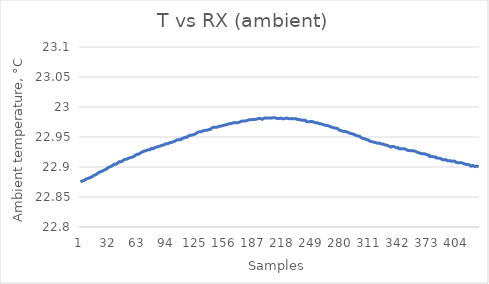
| Category | TRX |
|---|---|
| 0 | 22.875 |
| 1 | 22.876 |
| 2 | 22.877 |
| 3 | 22.877 |
| 4 | 22.878 |
| 5 | 22.878 |
| 6 | 22.88 |
| 7 | 22.88 |
| 8 | 22.881 |
| 9 | 22.881 |
| 10 | 22.882 |
| 11 | 22.882 |
| 12 | 22.883 |
| 13 | 22.885 |
| 14 | 22.886 |
| 15 | 22.887 |
| 16 | 22.887 |
| 17 | 22.887 |
| 18 | 22.889 |
| 19 | 22.89 |
| 20 | 22.891 |
| 21 | 22.892 |
| 22 | 22.892 |
| 23 | 22.892 |
| 24 | 22.894 |
| 25 | 22.894 |
| 26 | 22.895 |
| 27 | 22.897 |
| 28 | 22.897 |
| 29 | 22.899 |
| 30 | 22.899 |
| 31 | 22.9 |
| 32 | 22.901 |
| 33 | 22.901 |
| 34 | 22.902 |
| 35 | 22.903 |
| 36 | 22.905 |
| 37 | 22.905 |
| 38 | 22.905 |
| 39 | 22.906 |
| 40 | 22.907 |
| 41 | 22.909 |
| 42 | 22.909 |
| 43 | 22.909 |
| 44 | 22.91 |
| 45 | 22.91 |
| 46 | 22.912 |
| 47 | 22.911 |
| 48 | 22.913 |
| 49 | 22.913 |
| 50 | 22.913 |
| 51 | 22.915 |
| 52 | 22.915 |
| 53 | 22.914 |
| 54 | 22.916 |
| 55 | 22.918 |
| 56 | 22.917 |
| 57 | 22.918 |
| 58 | 22.919 |
| 59 | 22.92 |
| 60 | 22.921 |
| 61 | 22.921 |
| 62 | 22.921 |
| 63 | 22.923 |
| 64 | 22.923 |
| 65 | 22.924 |
| 66 | 22.925 |
| 67 | 22.924 |
| 68 | 22.926 |
| 69 | 22.927 |
| 70 | 22.927 |
| 71 | 22.929 |
| 72 | 22.929 |
| 73 | 22.928 |
| 74 | 22.929 |
| 75 | 22.93 |
| 76 | 22.931 |
| 77 | 22.931 |
| 78 | 22.93 |
| 79 | 22.932 |
| 80 | 22.932 |
| 81 | 22.933 |
| 82 | 22.933 |
| 83 | 22.934 |
| 84 | 22.934 |
| 85 | 22.935 |
| 86 | 22.936 |
| 87 | 22.936 |
| 88 | 22.937 |
| 89 | 22.937 |
| 90 | 22.937 |
| 91 | 22.939 |
| 92 | 22.939 |
| 93 | 22.939 |
| 94 | 22.939 |
| 95 | 22.94 |
| 96 | 22.94 |
| 97 | 22.941 |
| 98 | 22.941 |
| 99 | 22.942 |
| 100 | 22.943 |
| 101 | 22.943 |
| 102 | 22.943 |
| 103 | 22.945 |
| 104 | 22.944 |
| 105 | 22.945 |
| 106 | 22.946 |
| 107 | 22.945 |
| 108 | 22.947 |
| 109 | 22.947 |
| 110 | 22.948 |
| 111 | 22.948 |
| 112 | 22.95 |
| 113 | 22.95 |
| 114 | 22.95 |
| 115 | 22.952 |
| 116 | 22.953 |
| 117 | 22.953 |
| 118 | 22.952 |
| 119 | 22.953 |
| 120 | 22.953 |
| 121 | 22.954 |
| 122 | 22.956 |
| 123 | 22.955 |
| 124 | 22.956 |
| 125 | 22.958 |
| 126 | 22.958 |
| 127 | 22.959 |
| 128 | 22.958 |
| 129 | 22.959 |
| 130 | 22.961 |
| 131 | 22.96 |
| 132 | 22.962 |
| 133 | 22.961 |
| 134 | 22.962 |
| 135 | 22.961 |
| 136 | 22.961 |
| 137 | 22.962 |
| 138 | 22.964 |
| 139 | 22.963 |
| 140 | 22.965 |
| 141 | 22.964 |
| 142 | 22.966 |
| 143 | 22.966 |
| 144 | 22.966 |
| 145 | 22.966 |
| 146 | 22.966 |
| 147 | 22.967 |
| 148 | 22.968 |
| 149 | 22.968 |
| 150 | 22.968 |
| 151 | 22.968 |
| 152 | 22.969 |
| 153 | 22.97 |
| 154 | 22.97 |
| 155 | 22.971 |
| 156 | 22.97 |
| 157 | 22.971 |
| 158 | 22.972 |
| 159 | 22.972 |
| 160 | 22.972 |
| 161 | 22.972 |
| 162 | 22.973 |
| 163 | 22.974 |
| 164 | 22.974 |
| 165 | 22.975 |
| 166 | 22.974 |
| 167 | 22.975 |
| 168 | 22.974 |
| 169 | 22.975 |
| 170 | 22.975 |
| 171 | 22.976 |
| 172 | 22.976 |
| 173 | 22.976 |
| 174 | 22.977 |
| 175 | 22.977 |
| 176 | 22.977 |
| 177 | 22.976 |
| 178 | 22.978 |
| 179 | 22.977 |
| 180 | 22.979 |
| 181 | 22.978 |
| 182 | 22.979 |
| 183 | 22.979 |
| 184 | 22.979 |
| 185 | 22.98 |
| 186 | 22.979 |
| 187 | 22.98 |
| 188 | 22.98 |
| 189 | 22.979 |
| 190 | 22.981 |
| 191 | 22.981 |
| 192 | 22.981 |
| 193 | 22.98 |
| 194 | 22.979 |
| 195 | 22.98 |
| 196 | 22.981 |
| 197 | 22.981 |
| 198 | 22.982 |
| 199 | 22.981 |
| 200 | 22.981 |
| 201 | 22.982 |
| 202 | 22.982 |
| 203 | 22.981 |
| 204 | 22.982 |
| 205 | 22.981 |
| 206 | 22.982 |
| 207 | 22.981 |
| 208 | 22.982 |
| 209 | 22.982 |
| 210 | 22.981 |
| 211 | 22.982 |
| 212 | 22.981 |
| 213 | 22.981 |
| 214 | 22.982 |
| 215 | 22.982 |
| 216 | 22.98 |
| 217 | 22.98 |
| 218 | 22.981 |
| 219 | 22.981 |
| 220 | 22.982 |
| 221 | 22.98 |
| 222 | 22.981 |
| 223 | 22.979 |
| 224 | 22.98 |
| 225 | 22.981 |
| 226 | 22.981 |
| 227 | 22.98 |
| 228 | 22.981 |
| 229 | 22.98 |
| 230 | 22.981 |
| 231 | 22.98 |
| 232 | 22.979 |
| 233 | 22.979 |
| 234 | 22.979 |
| 235 | 22.979 |
| 236 | 22.978 |
| 237 | 22.978 |
| 238 | 22.978 |
| 239 | 22.977 |
| 240 | 22.978 |
| 241 | 22.976 |
| 242 | 22.976 |
| 243 | 22.975 |
| 244 | 22.976 |
| 245 | 22.976 |
| 246 | 22.976 |
| 247 | 22.976 |
| 248 | 22.975 |
| 249 | 22.975 |
| 250 | 22.975 |
| 251 | 22.974 |
| 252 | 22.974 |
| 253 | 22.974 |
| 254 | 22.973 |
| 255 | 22.972 |
| 256 | 22.972 |
| 257 | 22.972 |
| 258 | 22.972 |
| 259 | 22.971 |
| 260 | 22.971 |
| 261 | 22.97 |
| 262 | 22.97 |
| 263 | 22.969 |
| 264 | 22.969 |
| 265 | 22.969 |
| 266 | 22.968 |
| 267 | 22.967 |
| 268 | 22.967 |
| 269 | 22.966 |
| 270 | 22.966 |
| 271 | 22.965 |
| 272 | 22.964 |
| 273 | 22.965 |
| 274 | 22.964 |
| 275 | 22.964 |
| 276 | 22.962 |
| 277 | 22.962 |
| 278 | 22.961 |
| 279 | 22.961 |
| 280 | 22.96 |
| 281 | 22.96 |
| 282 | 22.959 |
| 283 | 22.958 |
| 284 | 22.959 |
| 285 | 22.957 |
| 286 | 22.958 |
| 287 | 22.956 |
| 288 | 22.956 |
| 289 | 22.956 |
| 290 | 22.955 |
| 291 | 22.954 |
| 292 | 22.954 |
| 293 | 22.953 |
| 294 | 22.953 |
| 295 | 22.953 |
| 296 | 22.952 |
| 297 | 22.951 |
| 298 | 22.951 |
| 299 | 22.95 |
| 300 | 22.95 |
| 301 | 22.948 |
| 302 | 22.949 |
| 303 | 22.947 |
| 304 | 22.947 |
| 305 | 22.946 |
| 306 | 22.946 |
| 307 | 22.945 |
| 308 | 22.944 |
| 309 | 22.943 |
| 310 | 22.943 |
| 311 | 22.942 |
| 312 | 22.943 |
| 313 | 22.942 |
| 314 | 22.941 |
| 315 | 22.941 |
| 316 | 22.94 |
| 317 | 22.94 |
| 318 | 22.94 |
| 319 | 22.94 |
| 320 | 22.939 |
| 321 | 22.939 |
| 322 | 22.938 |
| 323 | 22.938 |
| 324 | 22.937 |
| 325 | 22.937 |
| 326 | 22.936 |
| 327 | 22.936 |
| 328 | 22.936 |
| 329 | 22.935 |
| 330 | 22.935 |
| 331 | 22.933 |
| 332 | 22.934 |
| 333 | 22.934 |
| 334 | 22.934 |
| 335 | 22.934 |
| 336 | 22.933 |
| 337 | 22.932 |
| 338 | 22.932 |
| 339 | 22.932 |
| 340 | 22.931 |
| 341 | 22.931 |
| 342 | 22.931 |
| 343 | 22.93 |
| 344 | 22.93 |
| 345 | 22.929 |
| 346 | 22.93 |
| 347 | 22.929 |
| 348 | 22.929 |
| 349 | 22.928 |
| 350 | 22.927 |
| 351 | 22.928 |
| 352 | 22.927 |
| 353 | 22.926 |
| 354 | 22.927 |
| 355 | 22.926 |
| 356 | 22.927 |
| 357 | 22.925 |
| 358 | 22.926 |
| 359 | 22.925 |
| 360 | 22.924 |
| 361 | 22.924 |
| 362 | 22.923 |
| 363 | 22.923 |
| 364 | 22.922 |
| 365 | 22.922 |
| 366 | 22.922 |
| 367 | 22.922 |
| 368 | 22.922 |
| 369 | 22.92 |
| 370 | 22.92 |
| 371 | 22.92 |
| 372 | 22.92 |
| 373 | 22.917 |
| 374 | 22.917 |
| 375 | 22.918 |
| 376 | 22.917 |
| 377 | 22.917 |
| 378 | 22.916 |
| 379 | 22.917 |
| 380 | 22.915 |
| 381 | 22.915 |
| 382 | 22.915 |
| 383 | 22.915 |
| 384 | 22.915 |
| 385 | 22.915 |
| 386 | 22.912 |
| 387 | 22.913 |
| 388 | 22.912 |
| 389 | 22.912 |
| 390 | 22.912 |
| 391 | 22.911 |
| 392 | 22.91 |
| 393 | 22.912 |
| 394 | 22.911 |
| 395 | 22.91 |
| 396 | 22.909 |
| 397 | 22.908 |
| 398 | 22.91 |
| 399 | 22.91 |
| 400 | 22.909 |
| 401 | 22.908 |
| 402 | 22.908 |
| 403 | 22.907 |
| 404 | 22.908 |
| 405 | 22.907 |
| 406 | 22.907 |
| 407 | 22.907 |
| 408 | 22.906 |
| 409 | 22.906 |
| 410 | 22.905 |
| 411 | 22.905 |
| 412 | 22.905 |
| 413 | 22.904 |
| 414 | 22.905 |
| 415 | 22.904 |
| 416 | 22.904 |
| 417 | 22.901 |
| 418 | 22.903 |
| 419 | 22.903 |
| 420 | 22.902 |
| 421 | 22.901 |
| 422 | 22.902 |
| 423 | 22.902 |
| 424 | 22.902 |
| 425 | 22.901 |
| 426 | 22.901 |